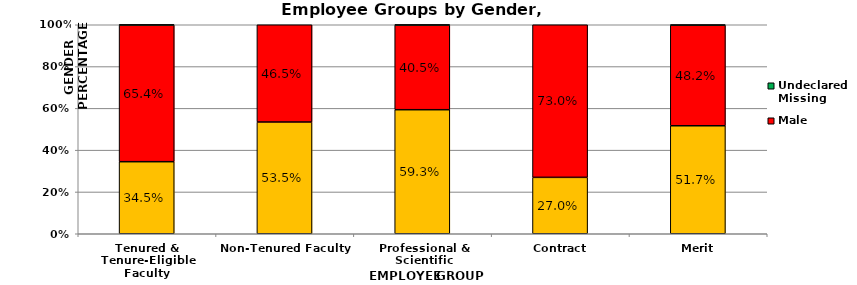
| Category | Female | Male | Undeclared/Missing |
|---|---|---|---|
| Tenured & Tenure-Eligible Faculty | 0.345 | 0.654 | 0.001 |
| Non-Tenured Faculty | 0.535 | 0.465 | 0 |
| Professional & Scientific | 0.593 | 0.405 | 0.001 |
| Contract | 0.27 | 0.73 | 0 |
| Merit | 0.517 | 0.482 | 0.002 |